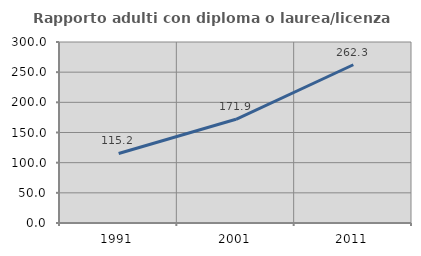
| Category | Rapporto adulti con diploma o laurea/licenza media  |
|---|---|
| 1991.0 | 115.224 |
| 2001.0 | 171.921 |
| 2011.0 | 262.269 |